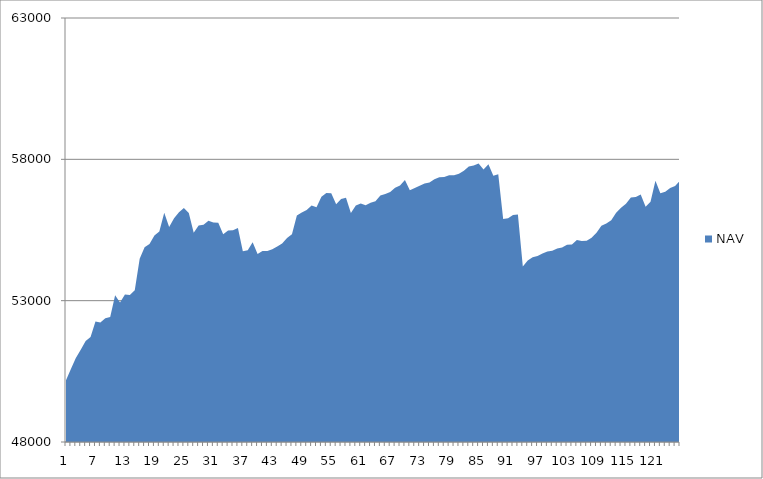
| Category | NAV |
|---|---|
| 0 | 50185.185 |
| 1 | 50585.185 |
| 2 | 50973.977 |
| 3 | 51265.977 |
| 4 | 51576.741 |
| 5 | 51711.523 |
| 6 | 52262.893 |
| 7 | 52230.24 |
| 8 | 52381.556 |
| 9 | 52425.915 |
| 10 | 53192.581 |
| 11 | 52939.146 |
| 12 | 53220.069 |
| 13 | 53197.341 |
| 14 | 53369.61 |
| 15 | 54480.721 |
| 16 | 54888.365 |
| 17 | 55001.902 |
| 18 | 55308.308 |
| 19 | 55448.308 |
| 20 | 56110.305 |
| 21 | 55610.305 |
| 22 | 55916.954 |
| 23 | 56129.798 |
| 24 | 56279.798 |
| 25 | 56105.301 |
| 26 | 55401.645 |
| 27 | 55657.201 |
| 28 | 55686.925 |
| 29 | 55823.001 |
| 30 | 55769.596 |
| 31 | 55759.375 |
| 32 | 55350.284 |
| 33 | 55480.284 |
| 34 | 55492.498 |
| 35 | 55570.42 |
| 36 | 54746.89 |
| 37 | 54783.7 |
| 38 | 55066.459 |
| 39 | 54651.074 |
| 40 | 54754.078 |
| 41 | 54760.213 |
| 42 | 54816.924 |
| 43 | 54917.296 |
| 44 | 55025.73 |
| 45 | 55220.535 |
| 46 | 55353.465 |
| 47 | 56009.309 |
| 48 | 56118.959 |
| 49 | 56205.212 |
| 50 | 56362.876 |
| 51 | 56307.394 |
| 52 | 56678.935 |
| 53 | 56813.264 |
| 54 | 56799.502 |
| 55 | 56409.112 |
| 56 | 56596.44 |
| 57 | 56640.493 |
| 58 | 56102.227 |
| 59 | 56370.449 |
| 60 | 56434.248 |
| 61 | 56376.841 |
| 62 | 56464.524 |
| 63 | 56518.022 |
| 64 | 56724.747 |
| 65 | 56770.361 |
| 66 | 56848.099 |
| 67 | 56992.896 |
| 68 | 57073.571 |
| 69 | 57266.481 |
| 70 | 56908.016 |
| 71 | 56984.939 |
| 72 | 57069.276 |
| 73 | 57147.627 |
| 74 | 57179.83 |
| 75 | 57291.17 |
| 76 | 57366.35 |
| 77 | 57371.599 |
| 78 | 57439.215 |
| 79 | 57440.895 |
| 80 | 57490.895 |
| 81 | 57593.679 |
| 82 | 57746.643 |
| 83 | 57785.413 |
| 84 | 57849.748 |
| 85 | 57639.346 |
| 86 | 57828.82 |
| 87 | 57417.055 |
| 88 | 57471.335 |
| 89 | 55888.376 |
| 90 | 55913.907 |
| 91 | 56031.989 |
| 92 | 56044.711 |
| 93 | 54210.631 |
| 94 | 54422.612 |
| 95 | 54536.647 |
| 96 | 54575.903 |
| 97 | 54670.229 |
| 98 | 54737.367 |
| 99 | 54762.386 |
| 100 | 54842.923 |
| 101 | 54881.385 |
| 102 | 54978.816 |
| 103 | 54991.283 |
| 104 | 55149.699 |
| 105 | 55109.498 |
| 106 | 55121.656 |
| 107 | 55227.569 |
| 108 | 55405.15 |
| 109 | 55650.183 |
| 110 | 55733.424 |
| 111 | 55846.244 |
| 112 | 56110.95 |
| 113 | 56283.172 |
| 114 | 56430.541 |
| 115 | 56648.489 |
| 116 | 56663.919 |
| 117 | 56752.272 |
| 118 | 56318.108 |
| 119 | 56496.442 |
| 120 | 57240.145 |
| 121 | 56797.081 |
| 122 | 56857.303 |
| 123 | 56985.874 |
| 124 | 57053.805 |
| 125 | 57249.117 |